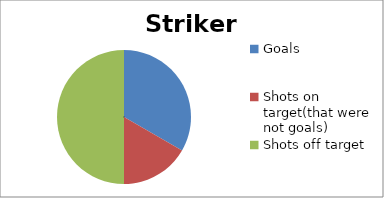
| Category | Striker 2 |
|---|---|
| Goals | 20 |
| Shots on target(that were not goals) | 10 |
| Shots off target | 30 |